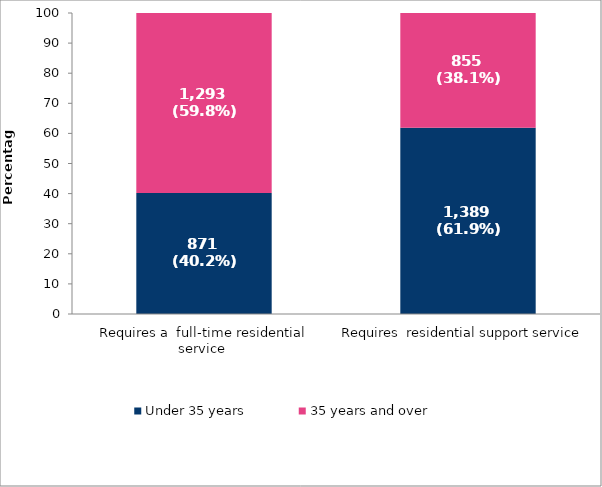
| Category | Under 35 years | 35 years and over |
|---|---|---|
| Requires a  full-time residential service  | 40.2 | 59.8 |
| Requires  residential support service  | 61.9 | 38.1 |